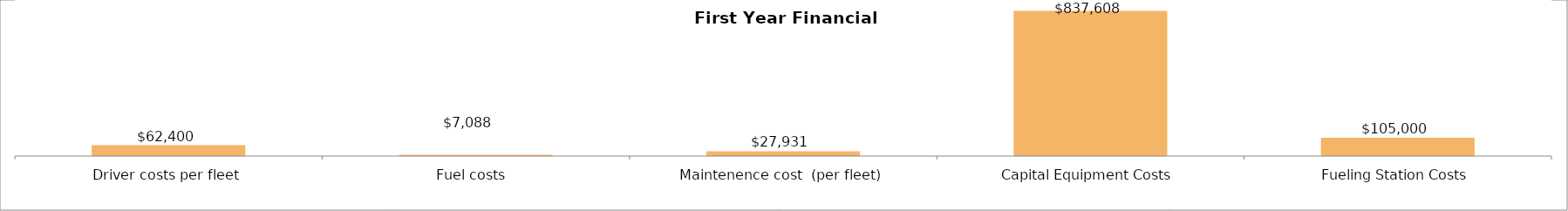
| Category | Series 0 |
|---|---|
| Driver costs per fleet | 62400 |
| Fuel costs  | 7087.968 |
| Maintenence cost  (per fleet) | 27931.321 |
| Capital Equipment Costs | 837608 |
| Fueling Station Costs | 105000 |